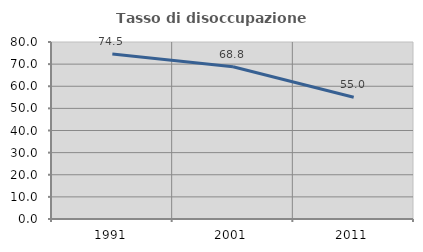
| Category | Tasso di disoccupazione giovanile  |
|---|---|
| 1991.0 | 74.54 |
| 2001.0 | 68.804 |
| 2011.0 | 55.013 |